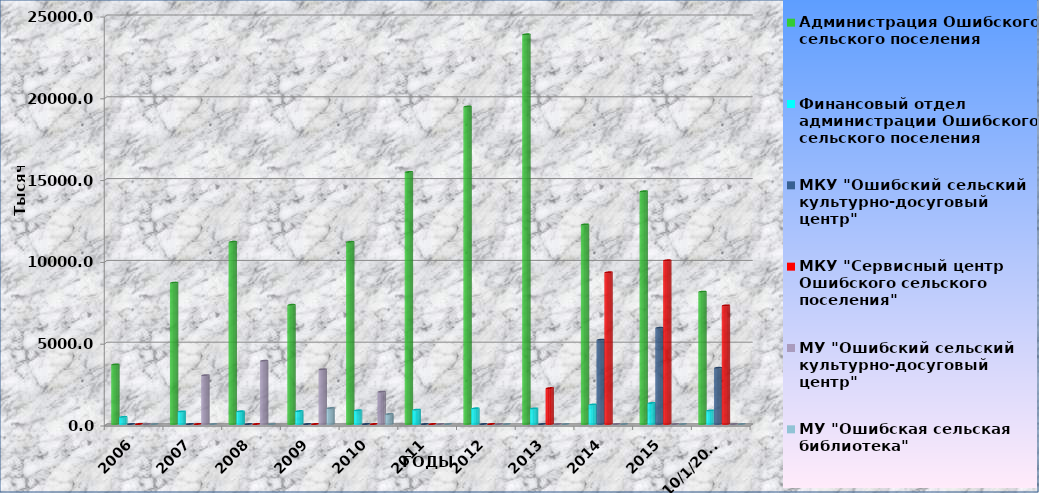
| Category | Всего расходов | в том числе: | Администрация Ошибского сельского поселения | МАУ "Ошибский сельский культурно-досуговый центр"  | МАУ "Ошибская сельская библиотека"  | Финансовый отдел администрации Ошибского сельского поселения | МКУ "Ошибский сельский культурно-досуговый центр"  | МКУ "Сервисный центр Ошибского сельского поселения" | МУ "Ошибский сельский культурно-досуговый центр" | МУ "Ошибская сельская библиотека"  |
|---|---|---|---|---|---|---|---|---|---|---|
| 2006.0 |  |  | 3637.4 |  |  | 436.3 | 0 | 0 | 0 | 0 |
| 2007.0 |  |  | 8641.3 |  |  | 770.5 | 0 | 0 | 2984.7 | 0 |
| 2008.0 |  |  | 11138.6 |  |  | 775.5 | 0 | 0 | 3866.5 | 0 |
| 2009.0 |  |  | 7285.3 |  |  | 790.8 | 0 | 0 | 3342 | 977.4 |
| 2010.0 |  |  | 11132.942 |  |  | 837.099 | 0 | 0 | 1976.914 | 615.622 |
| 2011.0 |  |  | 15408.339 |  |  | 877.032 | 0 | 0 | 0 | 0 |
| 2012.0 |  |  | 19407.82 |  |  | 959.379 | 0 | 0 | 0 | 0 |
| 2013.0 |  |  | 23820.154 |  |  | 951.375 | 0 | 2194.162 | 0 | 0 |
| 2014.0 |  |  | 12200.087 |  |  | 1192.923 | 5154.068 | 9274.466 | 0 | 0 |
| 2015.0 |  |  | 14226.5 |  |  | 1285.8 | 5882 | 10006.4 | 0 | 0 |
| 42644.0 |  |  | 8089.634 |  |  | 827.16 | 3436.065 | 7250.019 | 0 | 0 |